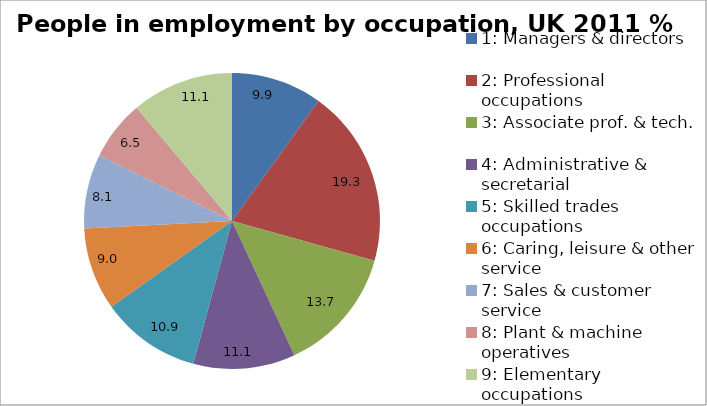
| Category | 2011 |
|---|---|
| 1: Managers & directors | 9.9 |
| 2: Professional occupations | 19.3 |
| 3: Associate prof. & tech. | 13.7 |
| 4: Administrative & secretarial  | 11.1 |
| 5: Skilled trades occupations | 10.9 |
| 6: Caring, leisure & other service  | 9 |
| 7: Sales & customer service  | 8.1 |
| 8: Plant & machine operatives | 6.5 |
| 9: Elementary occupations  | 11.1 |